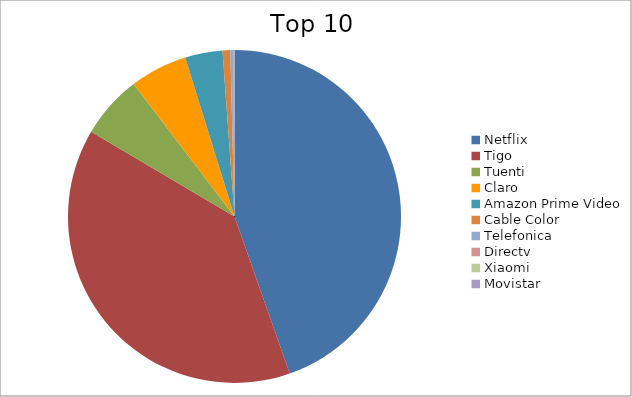
| Category | Series 0 |
|---|---|
| Netflix | 44.62 |
| Tigo | 38.87 |
| Tuenti | 6.15 |
| Claro | 5.58 |
| Amazon Prime Video | 3.63 |
| Cable Color | 0.75 |
| Telefonica | 0.29 |
| Directv | 0.07 |
| Xiaomi | 0.02 |
| Movistar | 0.02 |